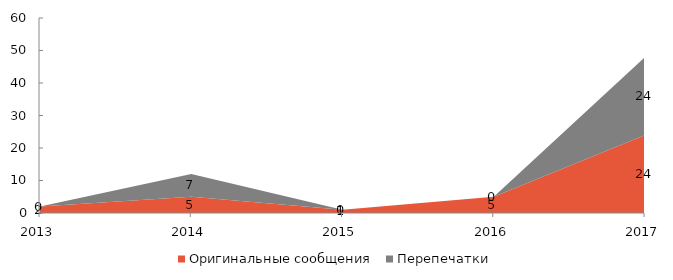
| Category | Оригинальные сообщения | Перепечатки |
|---|---|---|
| 2013 | 2 | 0 |
| 2014 | 5 | 7 |
| 2015 | 1 | 0 |
| 2016 | 5 | 0 |
| 2017 | 24 | 24 |